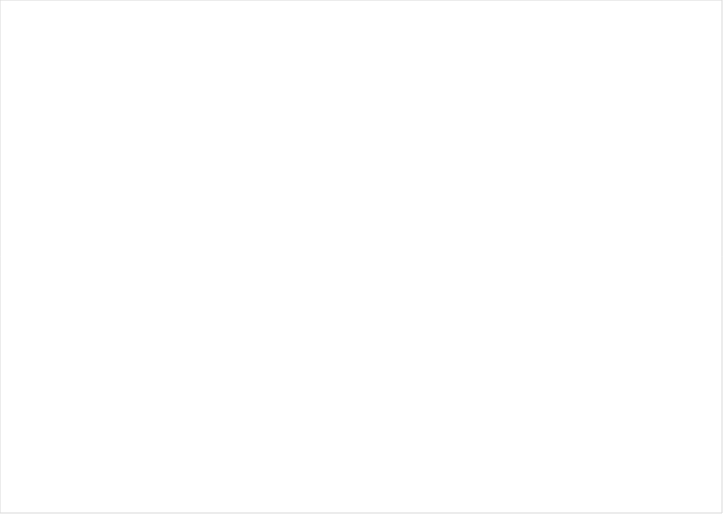
| Category | 2012 | 2013 | 2014 | 2015 | 2016 | 2017 | 2018 | 2019 | 2020 | 2021 | 2022 |
|---|---|---|---|---|---|---|---|---|---|---|---|
| Balie | 270568 | 297884 | 275868 | 119746 | 85099 | 92074 | 92271 | 107286 | 24758 | 8809 | 57870 |
| Chat | 10218 | 10632 | 10248 | 7 | 0 | 0 | 0 | 0 | 0 | 0 | 0 |
| E-mail | 26477 | 30848 | 34784 | 30601 | 37032 | 70843 | 62652 | 68176 | 102279 | 102279 | 56525 |
| Overleg wederpartij | 4318 | 4102 | 3721 | 2409 | 553 | 0 | 0 | 0 | 0 | 0 | 0 |
| Spreekuur | 63622 | 63259 | 48697 | 50838 | 53112 | 47163 | 41717 | 37192 | 8690 | 6393 | 15523 |
| Telefoon 0900 | 379152 | 437944 | 375184 | 369316 | 428781 | 395063 | 408791 | 387925 | 343615 | 313580 | 241241 |
| Telefoon overig | 25100 | 24646 | 20723 | 14408 | 16226 | 14928 | 13824 | 11931 | 10310 | 8346 | 7051 |
| Uitzoekwerk | 79459 | 108952 | 104008 | 94668 | 113097 | 117512 | 120587 | 111196 | 82100 | 89703 | 108809 |